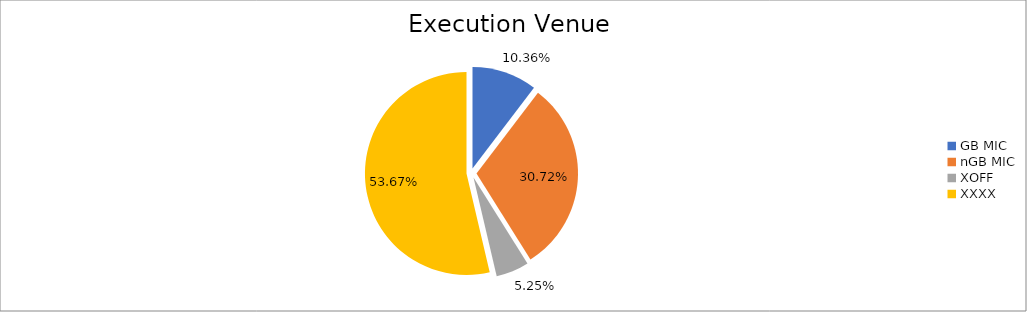
| Category | Series 0 |
|---|---|
| GB MIC | 889326.254 |
| nGB MIC | 2638521.068 |
| XOFF | 450918.481 |
| XXXX | 4609270.398 |